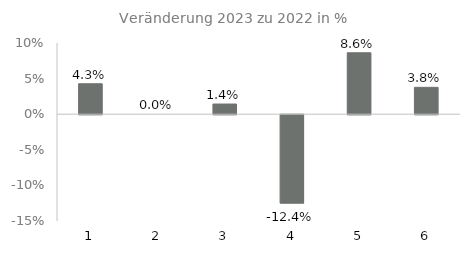
| Category | Series 1 |
|---|---|
| 0 | 0.043 |
| 1 | 0 |
| 2 | 0.014 |
| 3 | -0.124 |
| 4 | 0.086 |
| 5 | 0.038 |